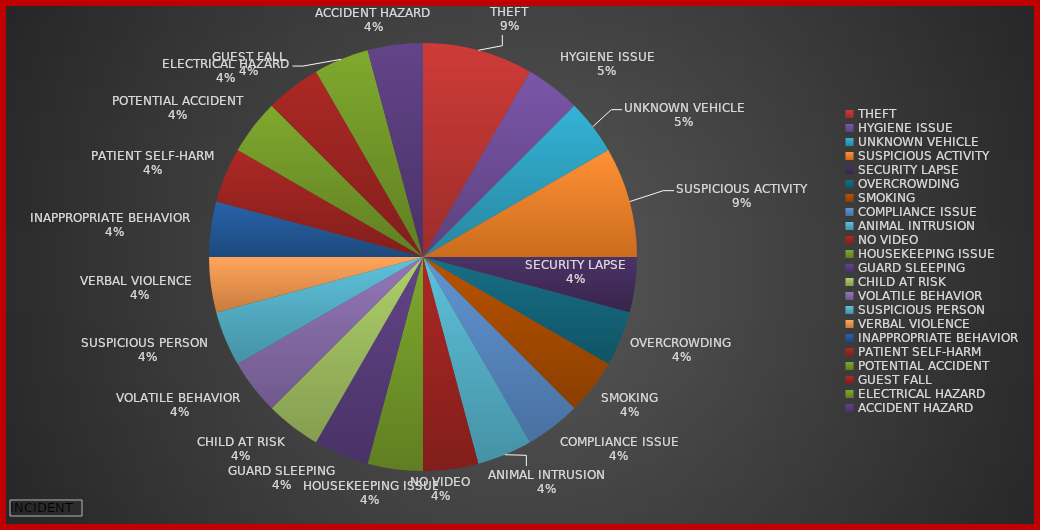
| Category | Total |
|---|---|
| THEFT | 2 |
| HYGIENE ISSUE | 1 |
| UNKNOWN VEHICLE | 1 |
| SUSPICIOUS ACTIVITY | 2 |
| SECURITY LAPSE | 1 |
| OVERCROWDING | 1 |
| SMOKING | 1 |
| COMPLIANCE ISSUE | 1 |
| ANIMAL INTRUSION | 1 |
| NO VIDEO | 1 |
| HOUSEKEEPING ISSUE | 1 |
| GUARD SLEEPING | 1 |
| CHILD AT RISK | 1 |
| VOLATILE BEHAVIOR  | 1 |
| SUSPICIOUS PERSON   | 1 |
| VERBAL VIOLENCE   | 1 |
| INAPPROPRIATE BEHAVIOR   | 1 |
| PATIENT SELF-HARM | 1 |
| POTENTIAL ACCIDENT | 1 |
| GUEST FALL | 1 |
| ELECTRICAL HAZARD | 1 |
| ACCIDENT HAZARD | 1 |